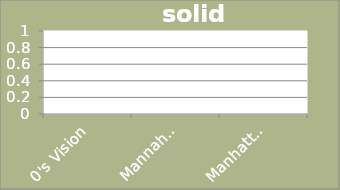
| Category | solid waste |
|---|---|
| 0's Vision | 0 |
| Mannahatta (1609) | 0 |
| Manhattan (2010) | 0 |